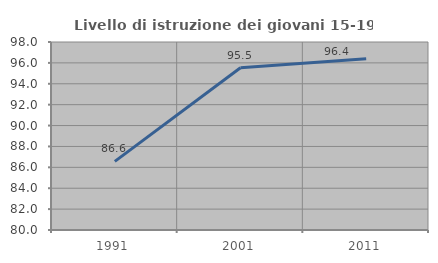
| Category | Livello di istruzione dei giovani 15-19 anni |
|---|---|
| 1991.0 | 86.567 |
| 2001.0 | 95.536 |
| 2011.0 | 96.386 |